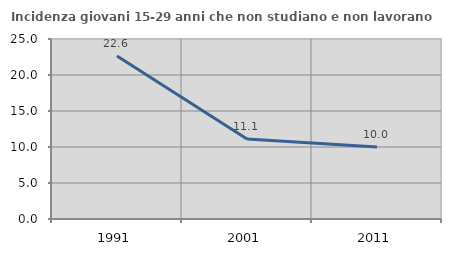
| Category | Incidenza giovani 15-29 anni che non studiano e non lavorano  |
|---|---|
| 1991.0 | 22.637 |
| 2001.0 | 11.111 |
| 2011.0 | 10 |